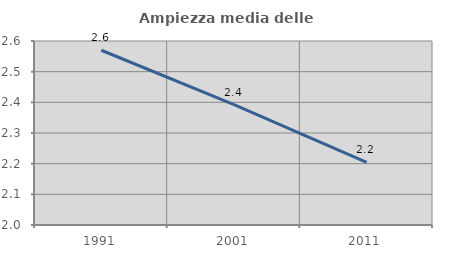
| Category | Ampiezza media delle famiglie |
|---|---|
| 1991.0 | 2.57 |
| 2001.0 | 2.393 |
| 2011.0 | 2.204 |